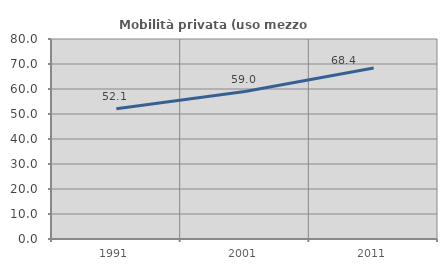
| Category | Mobilità privata (uso mezzo privato) |
|---|---|
| 1991.0 | 52.063 |
| 2001.0 | 58.999 |
| 2011.0 | 68.434 |